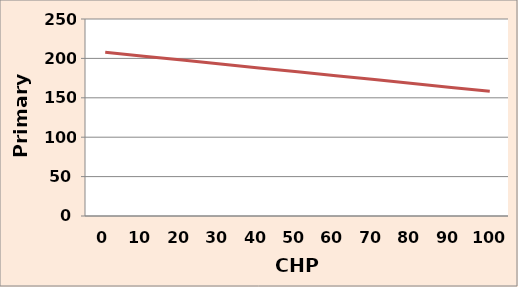
| Category | Prim.  energia |
|---|---|
| 0.0 | 207.792 |
| 10.0 | 202.835 |
| 20.0 | 197.878 |
| 30.0 | 192.921 |
| 40.0 | 187.964 |
| 50.0 | 183.007 |
| 60.0 | 178.05 |
| 70.0 | 173.093 |
| 80.0 | 168.136 |
| 90.0 | 163.179 |
| 100.0 | 158.222 |